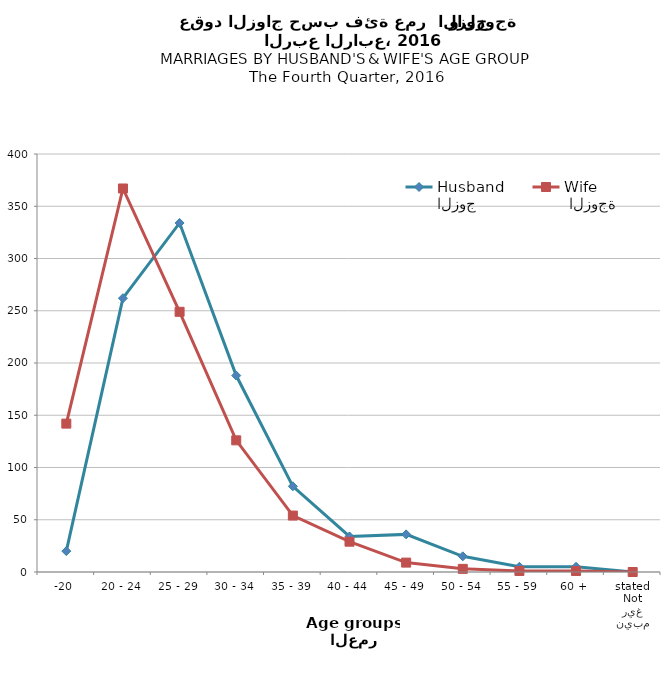
| Category | الزوج
Husband |  الزوجة
Wife |
|---|---|---|
| -20 | 20 | 142 |
| 20 - 24 | 262 | 367 |
| 25 - 29 | 334 | 249 |
| 30 - 34 | 188 | 126 |
| 35 - 39 | 82 | 54 |
| 40 - 44 | 34 | 29 |
| 45 - 49 | 36 | 9 |
| 50 - 54 | 15 | 3 |
| 55 - 59 | 5 | 1 |
| 60 + | 5 | 1 |
| غير مبين
Not stated | 0 | 0 |